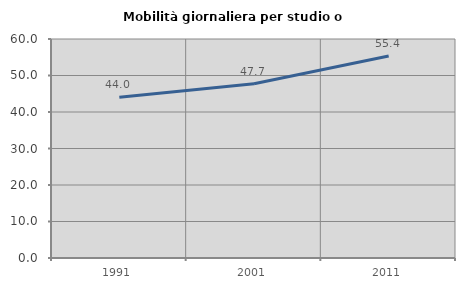
| Category | Mobilità giornaliera per studio o lavoro |
|---|---|
| 1991.0 | 44.037 |
| 2001.0 | 47.748 |
| 2011.0 | 55.357 |